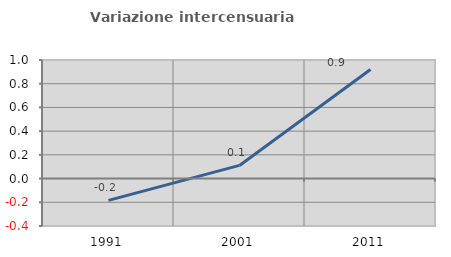
| Category | Variazione intercensuaria annua |
|---|---|
| 1991.0 | -0.184 |
| 2001.0 | 0.111 |
| 2011.0 | 0.919 |